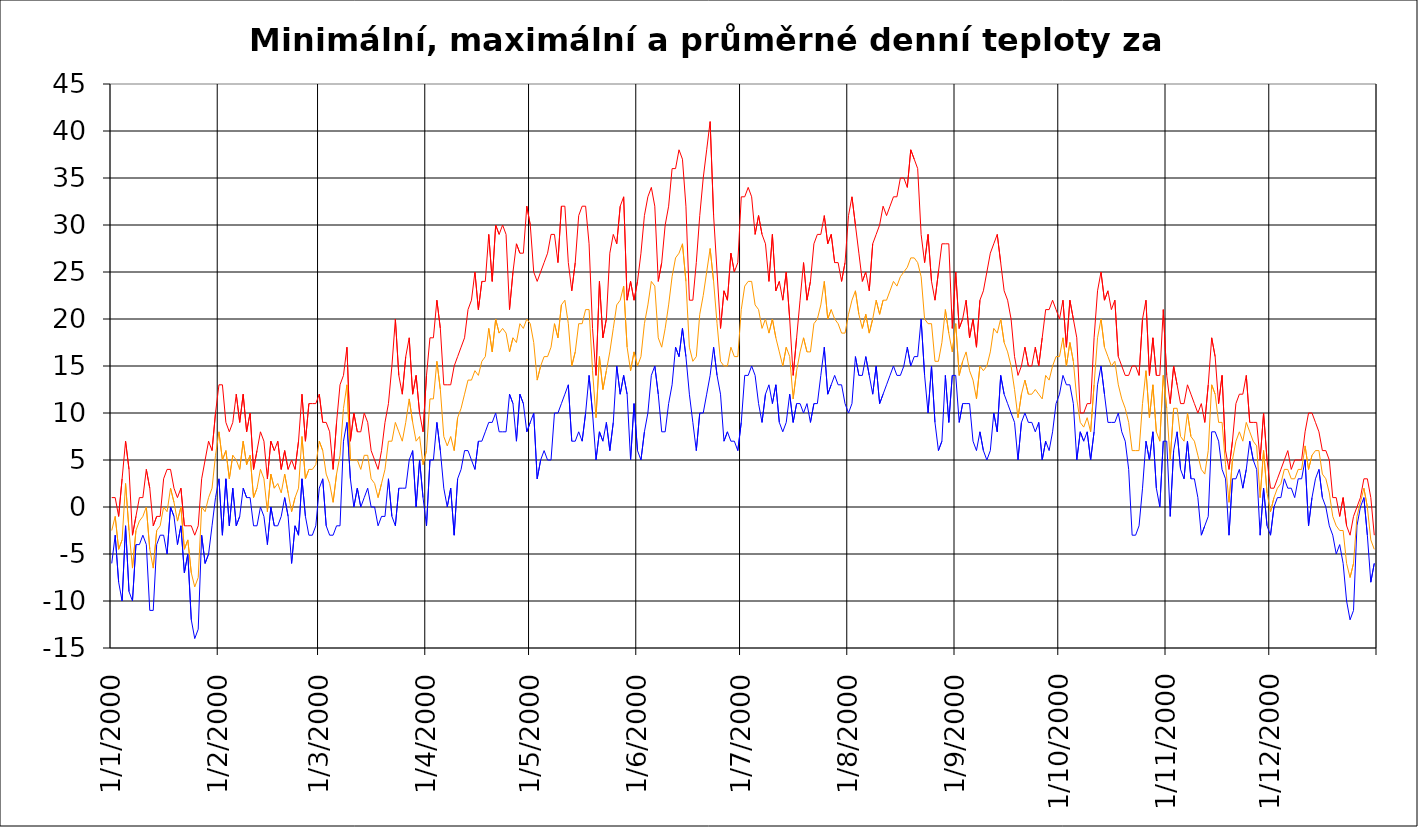
| Category | Series 0 | Series 1 | Series 2 |
|---|---|---|---|
| 2000-01-01 | -6 | 1 | -2.5 |
| 2000-01-02 | -3 | 1 | -1 |
| 2000-01-03 | -8 | -1 | -4.5 |
| 2000-01-04 | -10 | 3 | -3.5 |
| 2000-01-05 | -2 | 7 | 2.5 |
| 2000-01-06 | -9 | 4 | -2.5 |
| 2000-01-07 | -10 | -3 | -6.5 |
| 2000-01-08 | -4 | -1 | -2.5 |
| 2000-01-09 | -4 | 1 | -1.5 |
| 2000-01-10 | -3 | 1 | -1 |
| 2000-01-11 | -4 | 4 | 0 |
| 2000-01-12 | -11 | 2 | -4.5 |
| 2000-01-13 | -11 | -2 | -6.5 |
| 2000-01-14 | -4 | -1 | -2.5 |
| 2000-01-15 | -3 | -1 | -2 |
| 2000-01-16 | -3 | 3 | 0 |
| 2000-01-17 | -5 | 4 | -0.5 |
| 2000-01-18 | 0 | 4 | 2 |
| 2000-01-19 | -1 | 2 | 0.5 |
| 2000-01-20 | -4 | 1 | -1.5 |
| 2000-01-21 | -2 | 2 | 0 |
| 2000-01-22 | -7 | -2 | -4.5 |
| 2000-01-23 | -5 | -2 | -3.5 |
| 2000-01-24 | -12 | -2 | -7 |
| 2000-01-25 | -14 | -3 | -8.5 |
| 2000-01-26 | -13 | -2 | -7.5 |
| 2000-01-27 | -3 | 3 | 0 |
| 2000-01-28 | -6 | 5 | -0.5 |
| 2000-01-29 | -5 | 7 | 1 |
| 2000-01-30 | -2 | 6 | 2 |
| 2000-01-31 | 1 | 10 | 5.5 |
| 2000-02-01 | 3 | 13 | 8 |
| 2000-02-02 | -3 | 13 | 5 |
| 2000-02-03 | 3 | 9 | 6 |
| 2000-02-04 | -2 | 8 | 3 |
| 2000-02-05 | 2 | 9 | 5.5 |
| 2000-02-06 | -2 | 12 | 5 |
| 2000-02-07 | -1 | 9 | 4 |
| 2000-02-08 | 2 | 12 | 7 |
| 2000-02-09 | 1 | 8 | 4.5 |
| 2000-02-10 | 1 | 10 | 5.5 |
| 2000-02-11 | -2 | 4 | 1 |
| 2000-02-12 | -2 | 6 | 2 |
| 2000-02-13 | 0 | 8 | 4 |
| 2000-02-14 | -1 | 7 | 3 |
| 2000-02-15 | -4 | 3 | -0.5 |
| 2000-02-16 | 0 | 7 | 3.5 |
| 2000-02-17 | -2 | 6 | 2 |
| 2000-02-18 | -2 | 7 | 2.5 |
| 2000-02-19 | -1 | 4 | 1.5 |
| 2000-02-20 | 1 | 6 | 3.5 |
| 2000-02-21 | -1 | 4 | 1.5 |
| 2000-02-22 | -6 | 5 | -0.5 |
| 2000-02-23 | -2 | 4 | 1 |
| 2000-02-24 | -3 | 7 | 2 |
| 2000-02-25 | 3 | 12 | 7.5 |
| 2000-02-26 | -1 | 7 | 3 |
| 2000-02-27 | -3 | 11 | 4 |
| 2000-02-28 | -3 | 11 | 4 |
| 2000-02-29 | -2 | 11 | 4.5 |
| 2000-03-01 | 2 | 12 | 7 |
| 2000-03-02 | 3 | 9 | 6 |
| 2000-03-03 | -2 | 9 | 3.5 |
| 2000-03-04 | -3 | 8 | 2.5 |
| 2000-03-05 | -3 | 4 | 0.5 |
| 2000-03-06 | -2 | 9 | 3.5 |
| 2000-03-07 | -2 | 13 | 5.5 |
| 2000-03-08 | 7 | 14 | 10.5 |
| 2000-03-09 | 9 | 17 | 13 |
| 2000-03-10 | 3 | 7 | 5 |
| 2000-03-11 | 0 | 10 | 5 |
| 2000-03-12 | 2 | 8 | 5 |
| 2000-03-13 | 0 | 8 | 4 |
| 2000-03-14 | 1 | 10 | 5.5 |
| 2000-03-15 | 2 | 9 | 5.5 |
| 2000-03-16 | 0 | 6 | 3 |
| 2000-03-17 | 0 | 5 | 2.5 |
| 2000-03-18 | -2 | 4 | 1 |
| 2000-03-19 | -1 | 6 | 2.5 |
| 2000-03-20 | -1 | 9 | 4 |
| 2000-03-21 | 3 | 11 | 7 |
| 2000-03-22 | -1 | 15 | 7 |
| 2000-03-23 | -2 | 20 | 9 |
| 2000-03-24 | 2 | 14 | 8 |
| 2000-03-25 | 2 | 12 | 7 |
| 2000-03-26 | 2 | 16 | 9 |
| 2000-03-27 | 5 | 18 | 11.5 |
| 2000-03-28 | 6 | 12 | 9 |
| 2000-03-29 | 0 | 14 | 7 |
| 2000-03-30 | 5 | 10 | 7.5 |
| 2000-03-31 | 1 | 8 | 4.5 |
| 2000-04-01 | -2 | 14 | 6 |
| 2000-04-02 | 5 | 18 | 11.5 |
| 2000-04-03 | 5 | 18 | 11.5 |
| 2000-04-04 | 9 | 22 | 15.5 |
| 2000-04-05 | 6 | 19 | 12.5 |
| 2000-04-06 | 2 | 13 | 7.5 |
| 2000-04-07 | 0 | 13 | 6.5 |
| 2000-04-08 | 2 | 13 | 7.5 |
| 2000-04-09 | -3 | 15 | 6 |
| 2000-04-10 | 3 | 16 | 9.5 |
| 2000-04-11 | 4 | 17 | 10.5 |
| 2000-04-12 | 6 | 18 | 12 |
| 2000-04-13 | 6 | 21 | 13.5 |
| 2000-04-14 | 5 | 22 | 13.5 |
| 2000-04-15 | 4 | 25 | 14.5 |
| 2000-04-16 | 7 | 21 | 14 |
| 2000-04-17 | 7 | 24 | 15.5 |
| 2000-04-18 | 8 | 24 | 16 |
| 2000-04-19 | 9 | 29 | 19 |
| 2000-04-20 | 9 | 24 | 16.5 |
| 2000-04-21 | 10 | 30 | 20 |
| 2000-04-22 | 8 | 29 | 18.5 |
| 2000-04-23 | 8 | 30 | 19 |
| 2000-04-24 | 8 | 29 | 18.5 |
| 2000-04-25 | 12 | 21 | 16.5 |
| 2000-04-26 | 11 | 25 | 18 |
| 2000-04-27 | 7 | 28 | 17.5 |
| 2000-04-28 | 12 | 27 | 19.5 |
| 2000-04-29 | 11 | 27 | 19 |
| 2000-04-30 | 8 | 32 | 20 |
| 2000-05-01 | 9 | 30 | 19.5 |
| 2000-05-02 | 10 | 25 | 17.5 |
| 2000-05-03 | 3 | 24 | 13.5 |
| 2000-05-04 | 5 | 25 | 15 |
| 2000-05-05 | 6 | 26 | 16 |
| 2000-05-06 | 5 | 27 | 16 |
| 2000-05-07 | 5 | 29 | 17 |
| 2000-05-08 | 10 | 29 | 19.5 |
| 2000-05-09 | 10 | 26 | 18 |
| 2000-05-10 | 11 | 32 | 21.5 |
| 2000-05-11 | 12 | 32 | 22 |
| 2000-05-12 | 13 | 26 | 19.5 |
| 2000-05-13 | 7 | 23 | 15 |
| 2000-05-14 | 7 | 26 | 16.5 |
| 2000-05-15 | 8 | 31 | 19.5 |
| 2000-05-16 | 7 | 32 | 19.5 |
| 2000-05-17 | 10 | 32 | 21 |
| 2000-05-18 | 14 | 28 | 21 |
| 2000-05-19 | 10 | 19 | 14.5 |
| 2000-05-20 | 5 | 14 | 9.5 |
| 2000-05-21 | 8 | 24 | 16 |
| 2000-05-22 | 7 | 18 | 12.5 |
| 2000-05-23 | 9 | 20 | 14.5 |
| 2000-05-24 | 6 | 27 | 16.5 |
| 2000-05-25 | 9 | 29 | 19 |
| 2000-05-26 | 15 | 28 | 21.5 |
| 2000-05-27 | 12 | 32 | 22 |
| 2000-05-28 | 14 | 33 | 23.5 |
| 2000-05-29 | 12 | 22 | 17 |
| 2000-05-30 | 5 | 24 | 14.5 |
| 2000-05-31 | 11 | 22 | 16.5 |
| 2000-06-01 | 6 | 24 | 15 |
| 2000-06-02 | 5 | 27 | 16 |
| 2000-06-03 | 8 | 31 | 19.5 |
| 2000-06-04 | 10 | 33 | 21.5 |
| 2000-06-05 | 14 | 34 | 24 |
| 2000-06-06 | 15 | 32 | 23.5 |
| 2000-06-07 | 12 | 24 | 18 |
| 2000-06-08 | 8 | 26 | 17 |
| 2000-06-09 | 8 | 30 | 19 |
| 2000-06-10 | 11 | 32 | 21.5 |
| 2000-06-11 | 13 | 36 | 24.5 |
| 2000-06-12 | 17 | 36 | 26.5 |
| 2000-06-13 | 16 | 38 | 27 |
| 2000-06-14 | 19 | 37 | 28 |
| 2000-06-15 | 16 | 32 | 24 |
| 2000-06-16 | 12 | 22 | 17 |
| 2000-06-17 | 9 | 22 | 15.5 |
| 2000-06-18 | 6 | 26 | 16 |
| 2000-06-19 | 10 | 31 | 20.5 |
| 2000-06-20 | 10 | 35 | 22.5 |
| 2000-06-21 | 12 | 38 | 25 |
| 2000-06-22 | 14 | 41 | 27.5 |
| 2000-06-23 | 17 | 31 | 24 |
| 2000-06-24 | 14 | 25 | 19.5 |
| 2000-06-25 | 12 | 19 | 15.5 |
| 2000-06-26 | 7 | 23 | 15 |
| 2000-06-27 | 8 | 22 | 15 |
| 2000-06-28 | 7 | 27 | 17 |
| 2000-06-29 | 7 | 25 | 16 |
| 2000-06-30 | 6 | 26 | 16 |
| 2000-07-01 | 9 | 33 | 21 |
| 2000-07-02 | 14 | 33 | 23.5 |
| 2000-07-03 | 14 | 34 | 24 |
| 2000-07-04 | 15 | 33 | 24 |
| 2000-07-05 | 14 | 29 | 21.5 |
| 2000-07-06 | 11 | 31 | 21 |
| 2000-07-07 | 9 | 29 | 19 |
| 2000-07-08 | 12 | 28 | 20 |
| 2000-07-09 | 13 | 24 | 18.5 |
| 2000-07-10 | 11 | 29 | 20 |
| 2000-07-11 | 13 | 23 | 18 |
| 2000-07-12 | 9 | 24 | 16.5 |
| 2000-07-13 | 8 | 22 | 15 |
| 2000-07-14 | 9 | 25 | 17 |
| 2000-07-15 | 12 | 20 | 16 |
| 2000-07-16 | 9 | 14 | 11.5 |
| 2000-07-17 | 11 | 18 | 14.5 |
| 2000-07-18 | 11 | 22 | 16.5 |
| 2000-07-19 | 10 | 26 | 18 |
| 2000-07-20 | 11 | 22 | 16.5 |
| 2000-07-21 | 9 | 24 | 16.5 |
| 2000-07-22 | 11 | 28 | 19.5 |
| 2000-07-23 | 11 | 29 | 20 |
| 2000-07-24 | 14 | 29 | 21.5 |
| 2000-07-25 | 17 | 31 | 24 |
| 2000-07-26 | 12 | 28 | 20 |
| 2000-07-27 | 13 | 29 | 21 |
| 2000-07-28 | 14 | 26 | 20 |
| 2000-07-29 | 13 | 26 | 19.5 |
| 2000-07-30 | 13 | 24 | 18.5 |
| 2000-07-31 | 11 | 26 | 18.5 |
| 2000-08-01 | 10 | 31 | 20.5 |
| 2000-08-02 | 11 | 33 | 22 |
| 2000-08-03 | 16 | 30 | 23 |
| 2000-08-04 | 14 | 27 | 20.5 |
| 2000-08-05 | 14 | 24 | 19 |
| 2000-08-06 | 16 | 25 | 20.5 |
| 2000-08-07 | 14 | 23 | 18.5 |
| 2000-08-08 | 12 | 28 | 20 |
| 2000-08-09 | 15 | 29 | 22 |
| 2000-08-10 | 11 | 30 | 20.5 |
| 2000-08-11 | 12 | 32 | 22 |
| 2000-08-12 | 13 | 31 | 22 |
| 2000-08-13 | 14 | 32 | 23 |
| 2000-08-14 | 15 | 33 | 24 |
| 2000-08-15 | 14 | 33 | 23.5 |
| 2000-08-16 | 14 | 35 | 24.5 |
| 2000-08-17 | 15 | 35 | 25 |
| 2000-08-18 | 17 | 34 | 25.5 |
| 2000-08-19 | 15 | 38 | 26.5 |
| 2000-08-20 | 16 | 37 | 26.5 |
| 2000-08-21 | 16 | 36 | 26 |
| 2000-08-22 | 20 | 29 | 24.5 |
| 2000-08-23 | 14 | 26 | 20 |
| 2000-08-24 | 10 | 29 | 19.5 |
| 2000-08-25 | 15 | 24 | 19.5 |
| 2000-08-26 | 9 | 22 | 15.5 |
| 2000-08-27 | 6 | 25 | 15.5 |
| 2000-08-28 | 7 | 28 | 17.5 |
| 2000-08-29 | 14 | 28 | 21 |
| 2000-08-30 | 9 | 28 | 18.5 |
| 2000-08-31 | 14 | 19 | 16.5 |
| 2000-09-01 | 14 | 25 | 19.5 |
| 2000-09-02 | 9 | 19 | 14 |
| 2000-09-03 | 11 | 20 | 15.5 |
| 2000-09-04 | 11 | 22 | 16.5 |
| 2000-09-05 | 11 | 18 | 14.5 |
| 2000-09-06 | 7 | 20 | 13.5 |
| 2000-09-07 | 6 | 17 | 11.5 |
| 2000-09-08 | 8 | 22 | 15 |
| 2000-09-09 | 6 | 23 | 14.5 |
| 2000-09-10 | 5 | 25 | 15 |
| 2000-09-11 | 6 | 27 | 16.5 |
| 2000-09-12 | 10 | 28 | 19 |
| 2000-09-13 | 8 | 29 | 18.5 |
| 2000-09-14 | 14 | 26 | 20 |
| 2000-09-15 | 12 | 23 | 17.5 |
| 2000-09-16 | 11 | 22 | 16.5 |
| 2000-09-17 | 10 | 20 | 15 |
| 2000-09-18 | 9 | 16 | 12.5 |
| 2000-09-19 | 5 | 14 | 9.5 |
| 2000-09-20 | 9 | 15 | 12 |
| 2000-09-21 | 10 | 17 | 13.5 |
| 2000-09-22 | 9 | 15 | 12 |
| 2000-09-23 | 9 | 15 | 12 |
| 2000-09-24 | 8 | 17 | 12.5 |
| 2000-09-25 | 9 | 15 | 12 |
| 2000-09-26 | 5 | 18 | 11.5 |
| 2000-09-27 | 7 | 21 | 14 |
| 2000-09-28 | 6 | 21 | 13.5 |
| 2000-09-29 | 8 | 22 | 15 |
| 2000-09-30 | 11 | 21 | 16 |
| 2000-10-01 | 12 | 20 | 16 |
| 2000-10-02 | 14 | 22 | 18 |
| 2000-10-03 | 13 | 17 | 15 |
| 2000-10-04 | 13 | 22 | 17.5 |
| 2000-10-05 | 11 | 20 | 15.5 |
| 2000-10-06 | 5 | 18 | 11.5 |
| 2000-10-07 | 8 | 10 | 9 |
| 2000-10-08 | 7 | 10 | 8.5 |
| 2000-10-09 | 8 | 11 | 9.5 |
| 2000-10-10 | 5 | 11 | 8 |
| 2000-10-11 | 8 | 18 | 13 |
| 2000-10-12 | 13 | 23 | 18 |
| 2000-10-13 | 15 | 25 | 20 |
| 2000-10-14 | 12 | 22 | 17 |
| 2000-10-15 | 9 | 23 | 16 |
| 2000-10-16 | 9 | 21 | 15 |
| 2000-10-17 | 9 | 22 | 15.5 |
| 2000-10-18 | 10 | 16 | 13 |
| 2000-10-19 | 8 | 15 | 11.5 |
| 2000-10-20 | 7 | 14 | 10.5 |
| 2000-10-21 | 4 | 14 | 9 |
| 2000-10-22 | -3 | 15 | 6 |
| 2000-10-23 | -3 | 15 | 6 |
| 2000-10-24 | -2 | 14 | 6 |
| 2000-10-25 | 2 | 20 | 11 |
| 2000-10-26 | 7 | 22 | 14.5 |
| 2000-10-27 | 5 | 14 | 9.5 |
| 2000-10-28 | 8 | 18 | 13 |
| 2000-10-29 | 2 | 14 | 8 |
| 2000-10-30 | 0 | 14 | 7 |
| 2000-10-31 | 7 | 21 | 14 |
| 2000-11-01 | 7 | 14 | 10.5 |
| 2000-11-02 | -1 | 11 | 5 |
| 2000-11-03 | 6 | 15 | 10.5 |
| 2000-11-04 | 8 | 13 | 10.5 |
| 2000-11-05 | 4 | 11 | 7.5 |
| 2000-11-06 | 3 | 11 | 7 |
| 2000-11-07 | 7 | 13 | 10 |
| 2000-11-08 | 3 | 12 | 7.5 |
| 2000-11-09 | 3 | 11 | 7 |
| 2000-11-10 | 1 | 10 | 5.5 |
| 2000-11-11 | -3 | 11 | 4 |
| 2000-11-12 | -2 | 9 | 3.5 |
| 2000-11-13 | -1 | 13 | 6 |
| 2000-11-14 | 8 | 18 | 13 |
| 2000-11-15 | 8 | 16 | 12 |
| 2000-11-16 | 7 | 11 | 9 |
| 2000-11-17 | 4 | 14 | 9 |
| 2000-11-18 | 3 | 6 | 4.5 |
| 2000-11-19 | -3 | 4 | 0.5 |
| 2000-11-20 | 3 | 7 | 5 |
| 2000-11-21 | 3 | 11 | 7 |
| 2000-11-22 | 4 | 12 | 8 |
| 2000-11-23 | 2 | 12 | 7 |
| 2000-11-24 | 4 | 14 | 9 |
| 2000-11-25 | 7 | 9 | 8 |
| 2000-11-26 | 5 | 9 | 7 |
| 2000-11-27 | 4 | 9 | 6.5 |
| 2000-11-28 | -3 | 5 | 1 |
| 2000-11-29 | 2 | 10 | 6 |
| 2000-11-30 | -2 | 5 | 1.5 |
| 2000-12-01 | -3 | 2 | -0.5 |
| 2000-12-02 | 0 | 2 | 1 |
| 2000-12-03 | 1 | 3 | 2 |
| 2000-12-04 | 1 | 4 | 2.5 |
| 2000-12-05 | 3 | 5 | 4 |
| 2000-12-06 | 2 | 6 | 4 |
| 2000-12-07 | 2 | 4 | 3 |
| 2000-12-08 | 1 | 5 | 3 |
| 2000-12-09 | 3 | 5 | 4 |
| 2000-12-10 | 3 | 5 | 4 |
| 2000-12-11 | 5 | 8 | 6.5 |
| 2000-12-12 | -2 | 10 | 4 |
| 2000-12-13 | 1 | 10 | 5.5 |
| 2000-12-14 | 3 | 9 | 6 |
| 2000-12-15 | 4 | 8 | 6 |
| 2000-12-16 | 1 | 6 | 3.5 |
| 2000-12-17 | 0 | 6 | 3 |
| 2000-12-18 | -2 | 5 | 1.5 |
| 2000-12-19 | -3 | 1 | -1 |
| 2000-12-20 | -5 | 1 | -2 |
| 2000-12-21 | -4 | -1 | -2.5 |
| 2000-12-22 | -6 | 1 | -2.5 |
| 2000-12-23 | -10 | -2 | -6 |
| 2000-12-24 | -12 | -3 | -7.5 |
| 2000-12-25 | -11 | -1 | -6 |
| 2000-12-26 | -2 | 0 | -1 |
| 2000-12-27 | 0 | 1 | 0.5 |
| 2000-12-28 | 1 | 3 | 2 |
| 2000-12-29 | -3 | 3 | 0 |
| 2000-12-30 | -8 | 1 | -3.5 |
| 2000-12-31 | -6 | -3 | -4.5 |